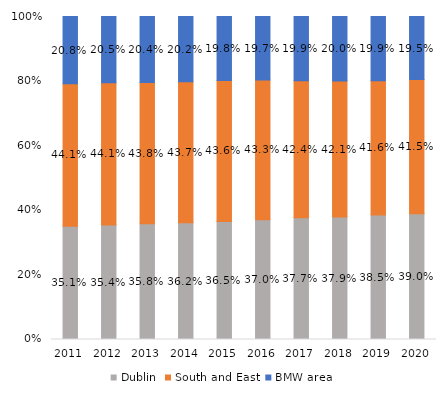
| Category | Dublin | South and East | BMW area |
|---|---|---|---|
| 2011.0 | 0.351 | 0.441 | 0.208 |
| 2012.0 | 0.354 | 0.441 | 0.205 |
| 2013.0 | 0.358 | 0.438 | 0.204 |
| 2014.0 | 0.362 | 0.437 | 0.202 |
| 2015.0 | 0.365 | 0.436 | 0.198 |
| 2016.0 | 0.37 | 0.433 | 0.197 |
| 2017.0 | 0.377 | 0.424 | 0.199 |
| 2018.0 | 0.379 | 0.421 | 0.2 |
| 2019.0 | 0.385 | 0.416 | 0.199 |
| 2020.0 | 0.39 | 0.415 | 0.195 |